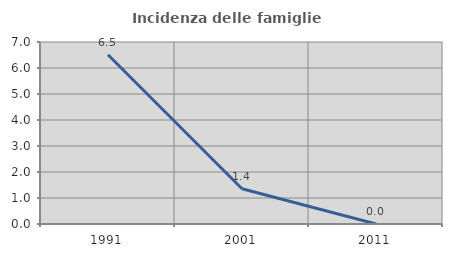
| Category | Incidenza delle famiglie numerose |
|---|---|
| 1991.0 | 6.512 |
| 2001.0 | 1.357 |
| 2011.0 | 0 |